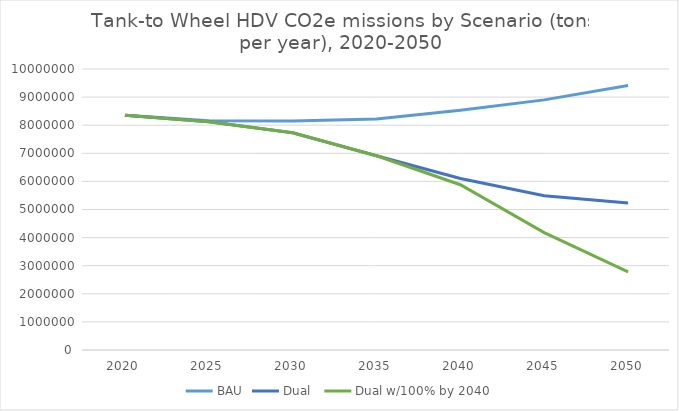
| Category | BAU | Dual  | Dual w/100% by 2040 |
|---|---|---|---|
| 2020.0 | 8356302.968 | 8356302.968 | 8356302.968 |
| 2025.0 | 8162099.164 | 8124940.343 | 8124940.343 |
| 2030.0 | 8152464.33 | 7732888.493 | 7732888.493 |
| 2035.0 | 8219669.119 | 6913133.301 | 6913133.301 |
| 2040.0 | 8534981.592 | 6100636.949 | 5882196.536 |
| 2045.0 | 8900791.068 | 5489671.479 | 4177655.584 |
| 2050.0 | 9411328.364 | 5227479.528 | 2782772.229 |